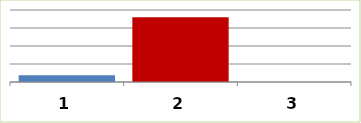
| Category | Series 0 |
|---|---|
| 0 | 3763234 |
| 1 | 35999065 |
| 2 | 0 |